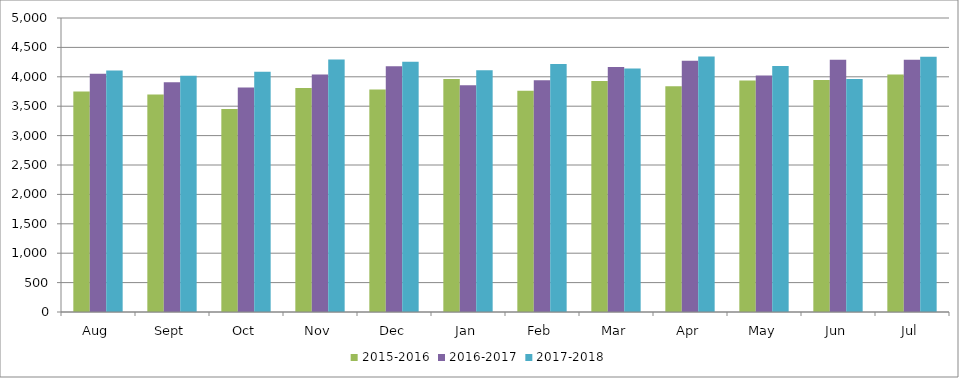
| Category | 2015-2016 | 2016-2017 | 2017-2018 |
|---|---|---|---|
| Aug | 3751 | 4050 | 4108 |
| Sept | 3700 | 3908 | 4017 |
| Oct | 3454 | 3818 | 4084 |
| Nov | 3809 | 4038 | 4294 |
| Dec | 3785 | 4179 | 4255 |
| Jan | 3961 | 3855 | 4110 |
| Feb | 3763 | 3942 | 4219 |
| Mar | 3930 | 4167 | 4142 |
| Apr | 3839 | 4271 | 4345 |
| May | 3937 | 4020 | 4184 |
| Jun | 3944 | 4289 | 3962 |
| Jul | 4038 | 4290 | 4340 |